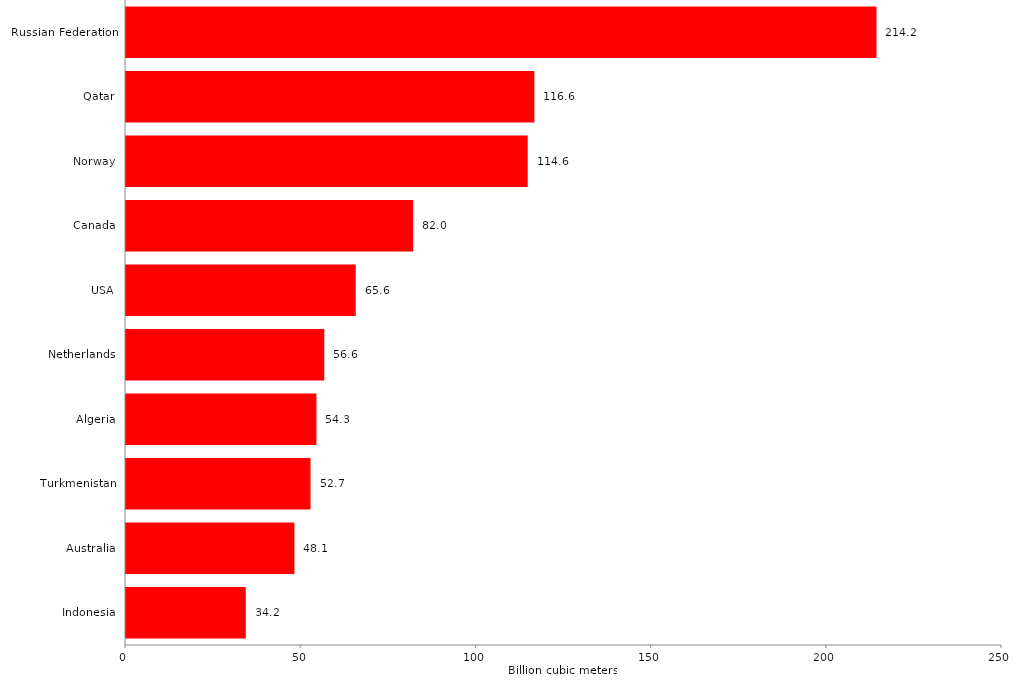
| Category |  34,2  |
|---|---|
| Indonesia | 34.18 |
| Australia | 48.07 |
| Turkmenistan | 52.66 |
| Algeria | 54.34 |
| Netherlands | 56.59 |
| USA | 65.56 |
| Canada | 81.97 |
| Norway | 114.64 |
| Qatar | 116.55 |
| Russian Federation | 214.18 |